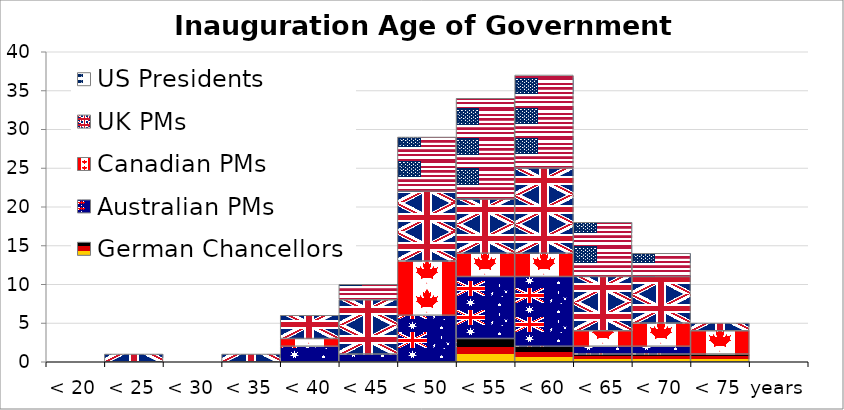
| Category | German Chancellors | Australian PMs | Canadian PMs | UK PMs | US Presidents |
|---|---|---|---|---|---|
| 20.0 | 0 | 0 | 0 | 0 | 0 |
| 25.0 | 0 | 0 | 0 | 1 | 0 |
| 30.0 | 0 | 0 | 0 | 0 | 0 |
| 35.0 | 0 | 0 | 0 | 1 | 0 |
| 40.0 | 0 | 2 | 1 | 3 | 0 |
| 45.0 | 0 | 1 | 0 | 7 | 2 |
| 50.0 | 0 | 6 | 7 | 9 | 7 |
| 55.0 | 3 | 8 | 3 | 7 | 13 |
| 60.0 | 2 | 9 | 3 | 11 | 12 |
| 65.0 | 1 | 1 | 2 | 7 | 7 |
| 70.0 | 1 | 1 | 3 | 6 | 3 |
| 75.0 | 1 | 0 | 3 | 1 | 0 |
| 80.0 | 0 | 0 | 0 | 0 | 0 |